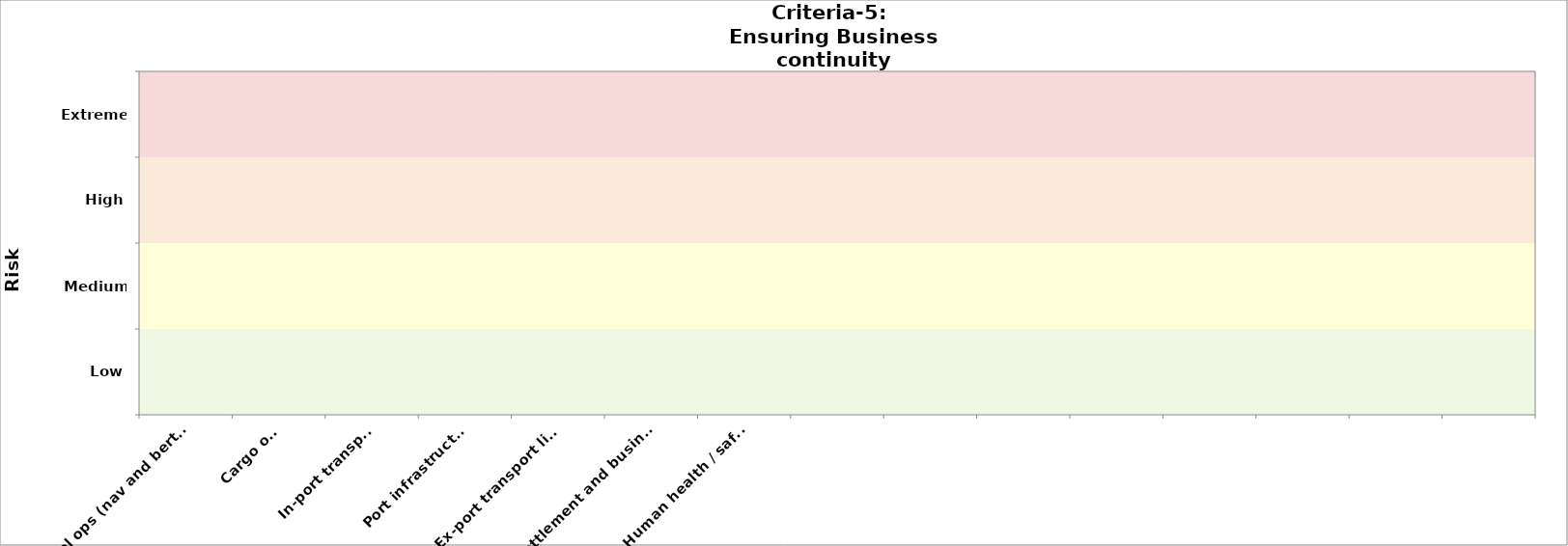
| Category | Criteria-3 (public health) | Criteria-5 
2030 |
|---|---|---|
| Vessel ops (nav and berthing) |  | 0 |
| Cargo ops |  | 0 |
| In-port transport |  | 0 |
| Port infrastructure |  | 0 |
| Ex-port transport links |  | 0 |
| Ex-port settlement and businesses |  | 0 |
| Human health / safety  |  | 0 |